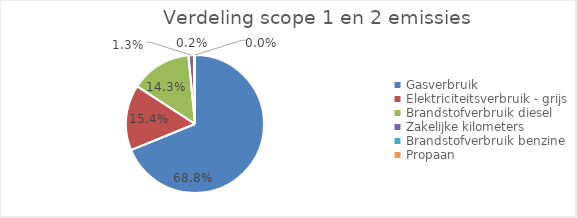
| Category | categorie |
|---|---|
| Gasverbruik | 946.311 |
| Elektriciteitsverbruik - grijs | 211.117 |
| Brandstofverbruik diesel | 196.377 |
| Zakelijke kilometers | 17.48 |
| Brandstofverbruik benzine | 3.217 |
| Propaan | 0.209 |